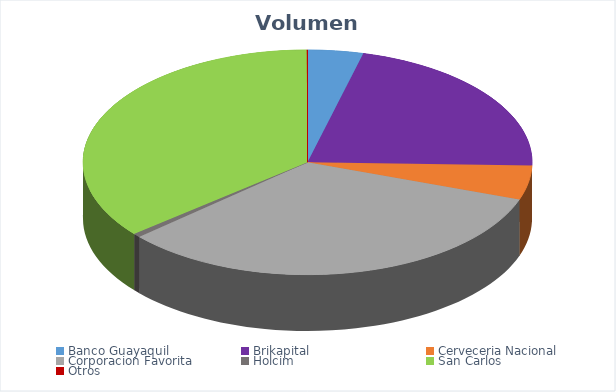
| Category | VOLUMEN ($USD) |
|---|---|
| Banco Guayaquil | 7450.56 |
| Brikapital | 40000 |
| Cerveceria Nacional | 9178.36 |
| Corporacion Favorita | 61683.81 |
| Holcim | 1001.3 |
| San Carlos | 67000 |
| Otros | 99 |